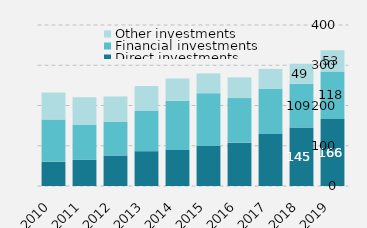
| Category | Direct investments | Financial investments | Other investments  |
|---|---|---|---|
| 0 | 60086.324 | 105113.94 | 67066.076 |
| 1 | 64841.884 | 87739.351 | 67903.259 |
| 2 | 75804.784 | 84167.444 | 62443.862 |
| 3 | 86531 | 99799.022 | 62166.761 |
| 4 | 89619.734 | 122339.712 | 55093.601 |
| 5 | 99312.693 | 131424.704 | 48957.737 |
| 6 | 107482.834 | 110894.583 | 51422.544 |
| 7 | 129142.817 | 112188.247 | 49688.684 |
| 8 | 145344.892 | 108951 | 49339 |
| 9 | 166229 | 118157 | 52909 |